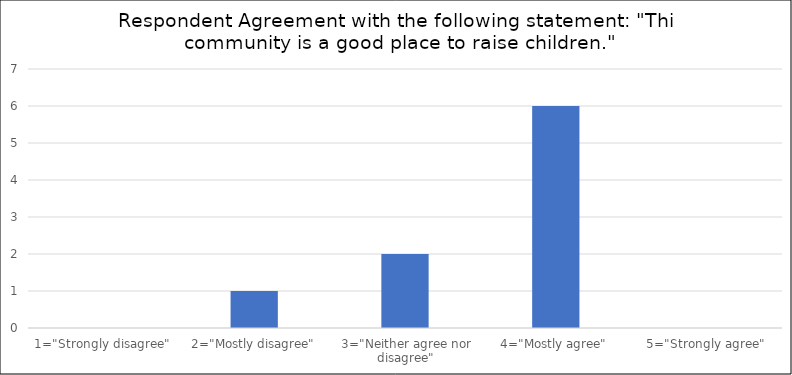
| Category | Number of Responses |
|---|---|
| 1="Strongly disagree" | 0 |
| 2="Mostly disagree" | 1 |
| 3="Neither agree nor disagree" | 2 |
| 4="Mostly agree" | 6 |
| 5="Strongly agree" | 0 |